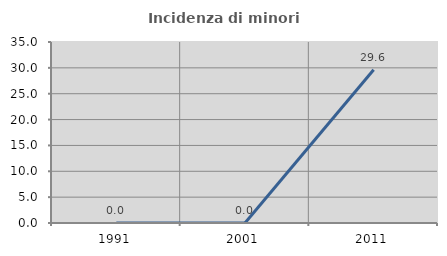
| Category | Incidenza di minori stranieri |
|---|---|
| 1991.0 | 0 |
| 2001.0 | 0 |
| 2011.0 | 29.63 |